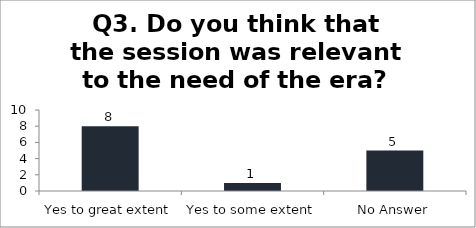
| Category | Q3. Do you think that the session was relevant to the need of the era? |
|---|---|
| Yes to great extent | 8 |
| Yes to some extent | 1 |
| No Answer | 5 |